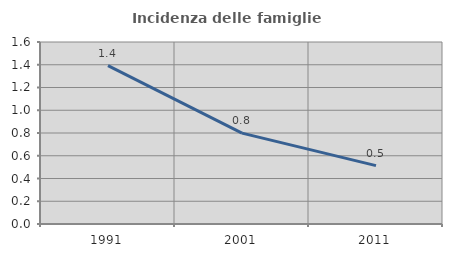
| Category | Incidenza delle famiglie numerose |
|---|---|
| 1991.0 | 1.392 |
| 2001.0 | 0.799 |
| 2011.0 | 0.513 |